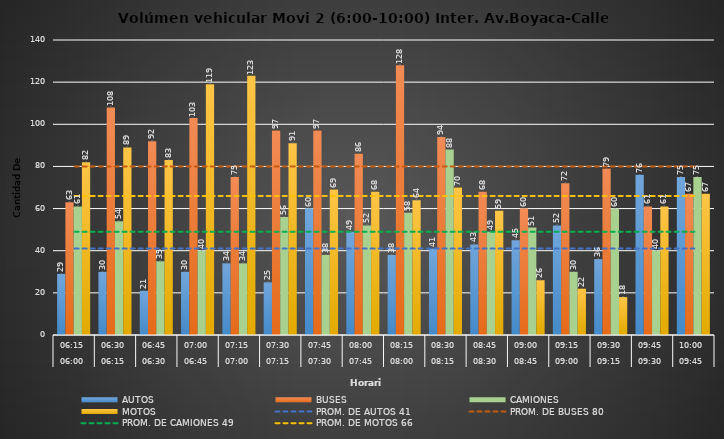
| Category | AUTOS | BUSES | CAMIONES | MOTOS |
|---|---|---|---|---|
| 0 | 29 | 63 | 61 | 82 |
| 1 | 30 | 108 | 54 | 89 |
| 2 | 21 | 92 | 35 | 83 |
| 3 | 30 | 103 | 40 | 119 |
| 4 | 34 | 75 | 34 | 123 |
| 5 | 25 | 97 | 56 | 91 |
| 6 | 60 | 97 | 38 | 69 |
| 7 | 49 | 86 | 52 | 68 |
| 8 | 38 | 128 | 58 | 64 |
| 9 | 41 | 94 | 88 | 70 |
| 10 | 43 | 68 | 49 | 59 |
| 11 | 45 | 60 | 51 | 26 |
| 12 | 52 | 72 | 30 | 22 |
| 13 | 36 | 79 | 60 | 18 |
| 14 | 76 | 61 | 40 | 61 |
| 15 | 75 | 67 | 75 | 67 |